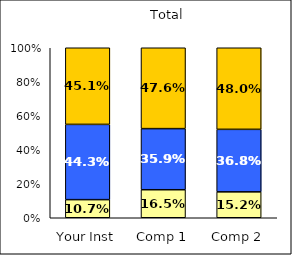
| Category | Low Social Agency | Average Social Agency | High Social Agency |
|---|---|---|---|
| Your Inst | 0.107 | 0.443 | 0.451 |
| Comp 1 | 0.165 | 0.359 | 0.476 |
| Comp 2 | 0.152 | 0.368 | 0.48 |